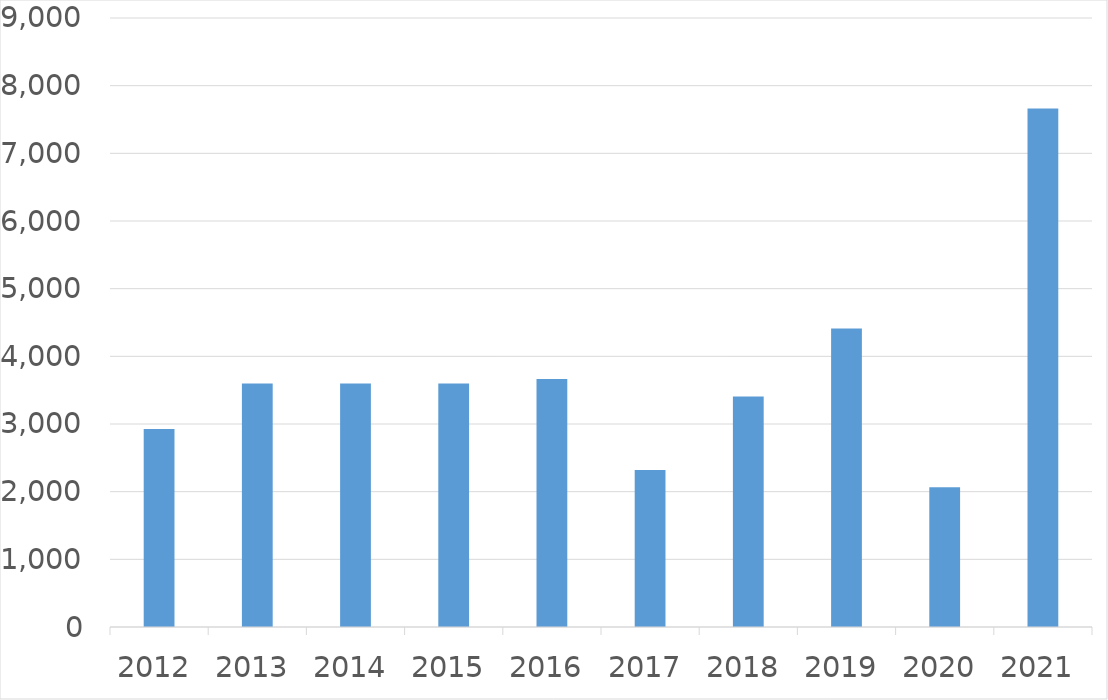
| Category | Series 0 |
|---|---|
| 2012 | 2925 |
| 2013 | 3600 |
| 2014 | 3600 |
| 2015 | 3600 |
| 2016 | 3666 |
| 2017 | 2320 |
| 2018 | 3406 |
| 2019 | 4413 |
| 2020 | 2065 |
| 2021 | 7664 |